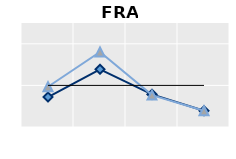
| Category | Né à l'étranger | Né dans le pays | Series 1 |
|---|---|---|---|
| 25-54 | 0.721 | 0.967 | 1 |
| 55-64 | 1.387 | 1.803 | 1 |
| 65+ | 0.785 | 0.766 | 1 |